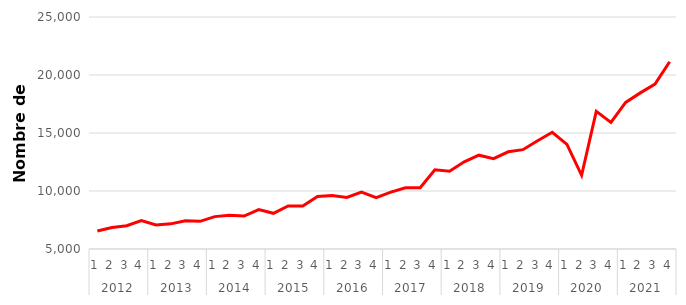
| Category | Série CVS-CJO * |
|---|---|
| 0 | 6554.471 |
| 1 | 6856.118 |
| 2 | 7012.11 |
| 3 | 7449.493 |
| 4 | 7076.014 |
| 5 | 7168.633 |
| 6 | 7443.108 |
| 7 | 7383.714 |
| 8 | 7792.185 |
| 9 | 7900.634 |
| 10 | 7844.295 |
| 11 | 8390.671 |
| 12 | 8076.596 |
| 13 | 8713.47 |
| 14 | 8707.16 |
| 15 | 9529.333 |
| 16 | 9619.267 |
| 17 | 9446.786 |
| 18 | 9909.688 |
| 19 | 9429.354 |
| 20 | 9904.461 |
| 21 | 10276.104 |
| 22 | 10280.214 |
| 23 | 11829.083 |
| 24 | 11703.765 |
| 25 | 12516.476 |
| 26 | 13086.507 |
| 27 | 12787.591 |
| 28 | 13377.719 |
| 29 | 13563.411 |
| 30 | 14330.134 |
| 31 | 15060.732 |
| 32 | 14013.648 |
| 33 | 11354.048 |
| 34 | 16872.384 |
| 35 | 15917.249 |
| 36 | 17636.121 |
| 37 | 18459.582 |
| 38 | 19217.756 |
| 39 | 21140.595 |